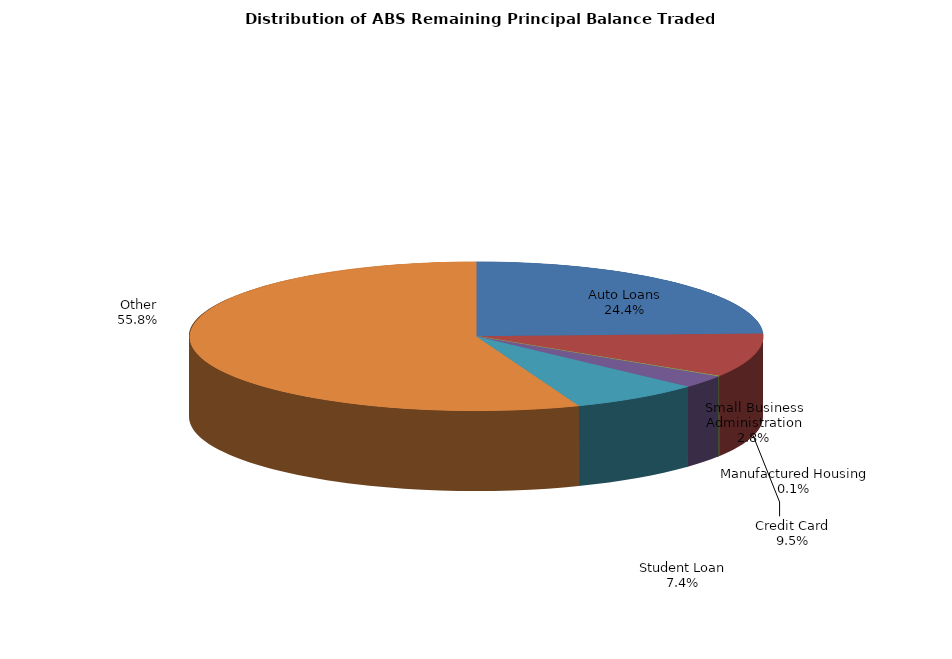
| Category | Series 0 |
|---|---|
| Auto Loans | 582963940.398 |
| Credit Card | 227454122.016 |
| Manufactured Housing | 2461925.274 |
| Small Business Administration | 66188102.426 |
| Student Loan | 176410850.121 |
| Other | 1333697738.884 |